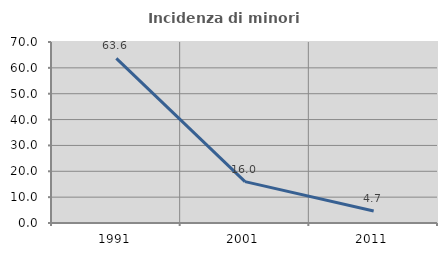
| Category | Incidenza di minori stranieri |
|---|---|
| 1991.0 | 63.636 |
| 2001.0 | 16 |
| 2011.0 | 4.651 |